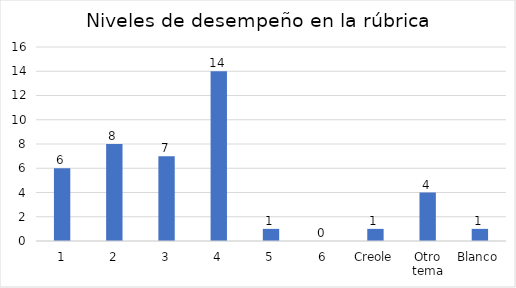
| Category | Textos |
|---|---|
| 1 | 6 |
| 2 | 8 |
| 3 | 7 |
| 4 | 14 |
| 5 | 1 |
| 6 | 0 |
| Creole | 1 |
| Otro tema | 4 |
| Blanco | 1 |